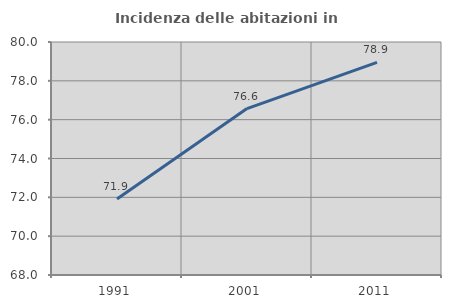
| Category | Incidenza delle abitazioni in proprietà  |
|---|---|
| 1991.0 | 71.918 |
| 2001.0 | 76.571 |
| 2011.0 | 78.947 |